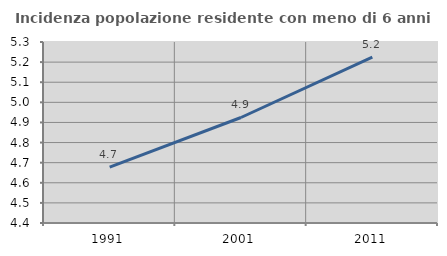
| Category | Incidenza popolazione residente con meno di 6 anni |
|---|---|
| 1991.0 | 4.677 |
| 2001.0 | 4.925 |
| 2011.0 | 5.225 |